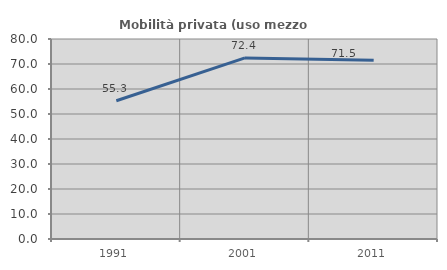
| Category | Mobilità privata (uso mezzo privato) |
|---|---|
| 1991.0 | 55.291 |
| 2001.0 | 72.437 |
| 2011.0 | 71.459 |